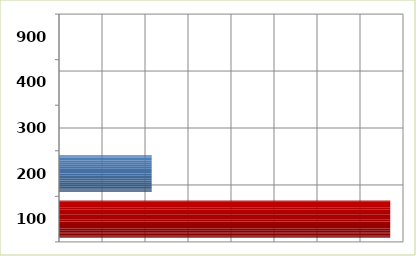
| Category | Series 0 |
|---|---|
| 100.0 | 15405920 |
| 200.0 | 4310108 |
| 300.0 | 0 |
| 400.0 | 0 |
| 900.0 | 0 |